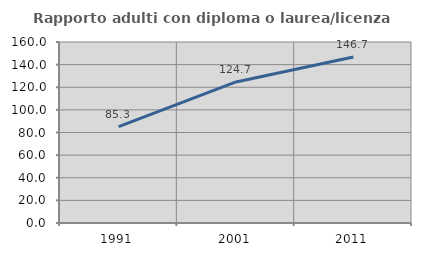
| Category | Rapporto adulti con diploma o laurea/licenza media  |
|---|---|
| 1991.0 | 85.261 |
| 2001.0 | 124.696 |
| 2011.0 | 146.743 |